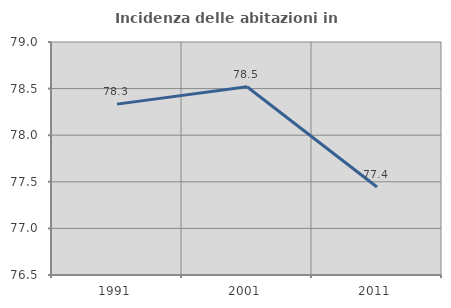
| Category | Incidenza delle abitazioni in proprietà  |
|---|---|
| 1991.0 | 78.333 |
| 2001.0 | 78.52 |
| 2011.0 | 77.444 |